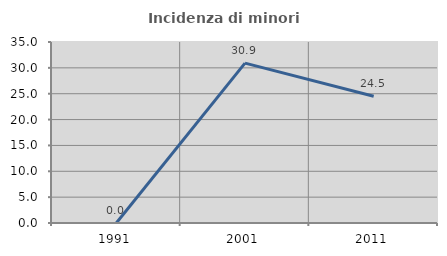
| Category | Incidenza di minori stranieri |
|---|---|
| 1991.0 | 0 |
| 2001.0 | 30.909 |
| 2011.0 | 24.51 |